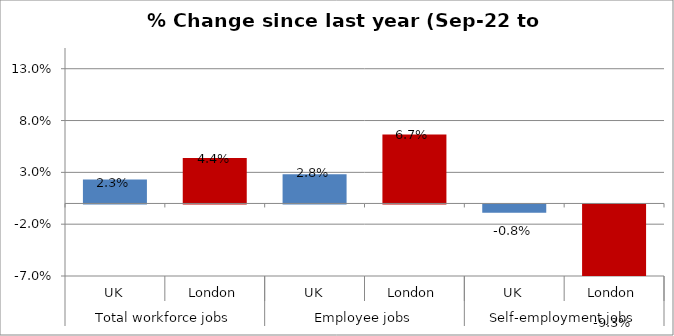
| Category | % Change since last year |
|---|---|
| 0 | 0.023 |
| 1 | 0.044 |
| 2 | 0.028 |
| 3 | 0.067 |
| 4 | -0.008 |
| 5 | -0.093 |